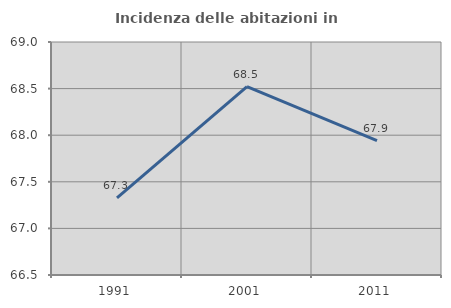
| Category | Incidenza delle abitazioni in proprietà  |
|---|---|
| 1991.0 | 67.327 |
| 2001.0 | 68.521 |
| 2011.0 | 67.941 |